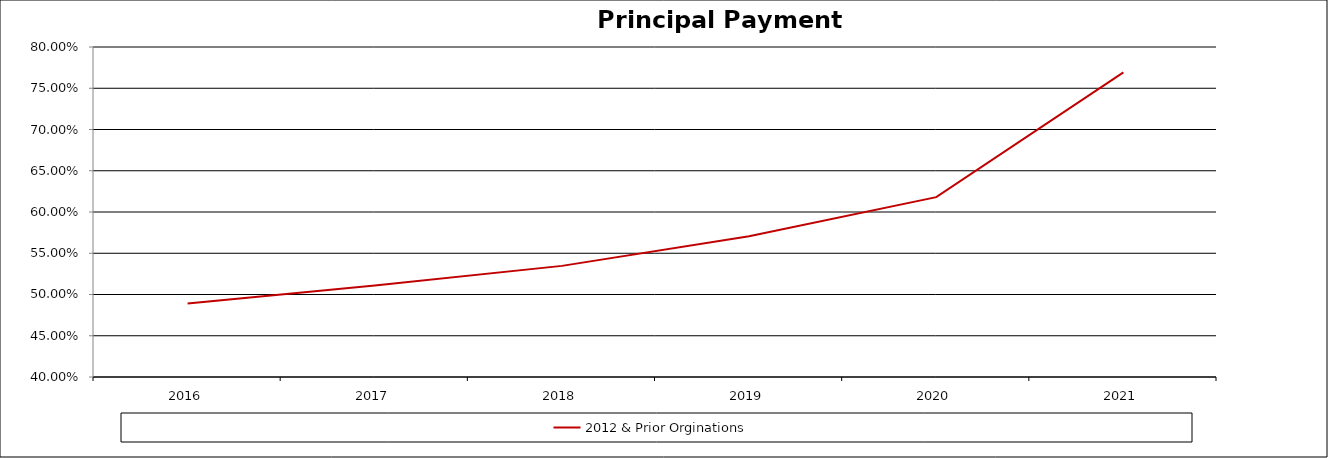
| Category | 2012 & Prior Orginations  |
|---|---|
| 2016.0 | 0.489 |
| 2017.0 | 0.511 |
| 2018.0 | 0.535 |
| 2019.0 | 0.57 |
| 2020.0 | 0.618 |
| 2021.0 | 0.769 |